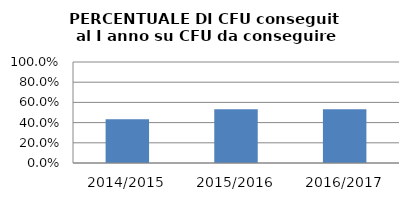
| Category | 2014/2015 2015/2016 2016/2017 |
|---|---|
| 2014/2015 | 0.434 |
| 2015/2016 | 0.532 |
| 2016/2017 | 0.532 |